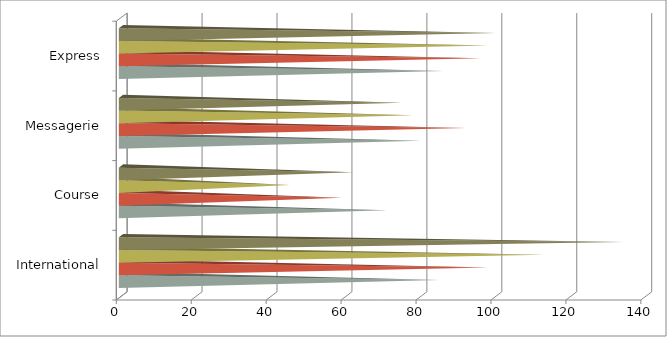
| Category | TRIM.1 | TRIM.2 | TRIM.3 | TRIM.4 |
|---|---|---|---|---|
| International | 85 | 98 | 113 | 134 |
| Course | 71 | 59 | 45 | 62 |
| Messagerie | 80 | 92 | 78 | 75 |
| Express | 86 | 96 | 98 | 100 |